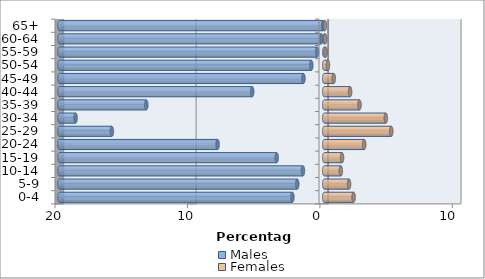
| Category | Males | Females |
|---|---|---|
| 0-4 | -2.404 | 2.216 |
| 5-9 | -2.035 | 1.875 |
| 10-14 | -1.608 | 1.254 |
| 15-19 | -3.588 | 1.347 |
| 20-24 | -8.05 | 3.021 |
| 25-29 | -16.036 | 5.059 |
| 30-34 | -18.774 | 4.649 |
| 35-39 | -13.436 | 2.662 |
| 40-44 | -5.437 | 1.957 |
| 45-49 | -1.568 | 0.719 |
| 50-54 | -0.976 | 0.281 |
| 55-59 | -0.536 | 0.099 |
| 60-64 | -0.208 | 0.069 |
| 65+ | -0.089 | 0.049 |